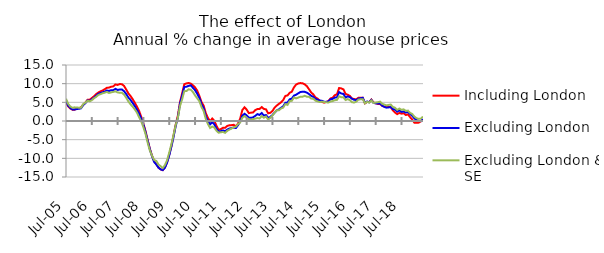
| Category | Including London | Excluding London | Excluding London & SE |
|---|---|---|---|
| 2005-07-01 | 4.985 | 5.285 | 5.958 |
| 2005-08-01 | 3.942 | 4.148 | 4.612 |
| 2005-09-01 | 3.341 | 3.501 | 3.879 |
| 2005-10-01 | 3.024 | 3.094 | 3.539 |
| 2005-11-01 | 3.025 | 3.077 | 3.658 |
| 2005-12-01 | 3.322 | 3.21 | 3.603 |
| 2006-01-01 | 3.425 | 3.273 | 3.573 |
| 2006-02-01 | 3.671 | 3.415 | 3.543 |
| 2006-03-01 | 4.341 | 4.268 | 4.537 |
| 2006-04-01 | 4.935 | 4.761 | 4.907 |
| 2006-05-01 | 5.674 | 5.506 | 5.421 |
| 2006-06-01 | 5.696 | 5.38 | 5.292 |
| 2006-07-01 | 6.145 | 5.816 | 5.555 |
| 2006-08-01 | 6.611 | 6.227 | 6.099 |
| 2006-09-01 | 7.182 | 6.748 | 6.46 |
| 2006-10-01 | 7.614 | 7.259 | 6.976 |
| 2006-11-01 | 7.936 | 7.496 | 7.178 |
| 2006-12-01 | 8.161 | 7.69 | 7.429 |
| 2007-01-01 | 8.511 | 7.868 | 7.579 |
| 2007-02-01 | 8.903 | 8.173 | 7.775 |
| 2007-03-01 | 8.951 | 8.042 | 7.493 |
| 2007-04-01 | 9.183 | 8.253 | 7.683 |
| 2007-05-01 | 9.276 | 8.26 | 7.795 |
| 2007-06-01 | 9.793 | 8.619 | 7.94 |
| 2007-07-01 | 9.657 | 8.303 | 7.666 |
| 2007-08-01 | 9.904 | 8.435 | 7.557 |
| 2007-09-01 | 9.848 | 8.43 | 7.59 |
| 2007-10-01 | 9.4 | 7.992 | 7.065 |
| 2007-11-01 | 8.429 | 7.205 | 6.216 |
| 2007-12-01 | 7.399 | 6.295 | 5.257 |
| 2008-01-01 | 6.692 | 5.641 | 4.468 |
| 2008-02-01 | 5.846 | 4.829 | 3.835 |
| 2008-03-01 | 4.892 | 3.992 | 3.095 |
| 2008-04-01 | 3.832 | 3.006 | 2.25 |
| 2008-05-01 | 2.671 | 1.945 | 1 |
| 2008-06-01 | 1.093 | 0.56 | -0.149 |
| 2008-07-01 | -0.669 | -0.999 | -1.68 |
| 2008-08-01 | -2.797 | -3.023 | -3.517 |
| 2008-09-01 | -5.166 | -5.325 | -5.862 |
| 2008-10-01 | -7.43 | -7.61 | -7.915 |
| 2008-11-01 | -9.307 | -9.425 | -9.312 |
| 2008-12-01 | -10.774 | -10.987 | -10.43 |
| 2009-01-01 | -11.579 | -11.649 | -10.704 |
| 2009-02-01 | -12.48 | -12.489 | -11.651 |
| 2009-03-01 | -12.965 | -12.948 | -12.105 |
| 2009-04-01 | -13.168 | -13.142 | -12.6 |
| 2009-05-01 | -12.416 | -12.532 | -11.801 |
| 2009-06-01 | -11.052 | -11.15 | -10.53 |
| 2009-07-01 | -9.03 | -9.21 | -8.474 |
| 2009-08-01 | -6.728 | -6.864 | -6.24 |
| 2009-09-01 | -3.894 | -4.294 | -3.737 |
| 2009-10-01 | -0.973 | -1.356 | -1.099 |
| 2009-11-01 | 1.393 | 0.824 | 0.793 |
| 2009-12-01 | 5.017 | 4.628 | 4.013 |
| 2010-01-01 | 7.384 | 6.795 | 5.826 |
| 2010-02-01 | 9.855 | 9.102 | 7.992 |
| 2010-03-01 | 10.07 | 9.191 | 8.012 |
| 2010-04-01 | 10.175 | 9.397 | 8.489 |
| 2010-05-01 | 10.021 | 9.556 | 8.394 |
| 2010-06-01 | 9.57 | 8.896 | 7.769 |
| 2010-07-01 | 9.01 | 8.261 | 6.872 |
| 2010-08-01 | 8.161 | 7.3 | 6.091 |
| 2010-09-01 | 6.737 | 6.228 | 5.324 |
| 2010-10-01 | 5.097 | 4.504 | 3.767 |
| 2010-11-01 | 4.119 | 3.44 | 2.672 |
| 2010-12-01 | 2.107 | 1.205 | 0.55 |
| 2011-01-01 | 0.832 | -0.007 | -0.817 |
| 2011-02-01 | -0.064 | -0.916 | -1.859 |
| 2011-03-01 | 0.664 | -0.28 | -1.49 |
| 2011-04-01 | 0.04 | -0.934 | -1.774 |
| 2011-05-01 | -1.33 | -2.127 | -2.627 |
| 2011-06-01 | -2.373 | -2.831 | -3.144 |
| 2011-07-01 | -2.175 | -2.71 | -3.01 |
| 2011-08-01 | -1.82 | -2.516 | -2.938 |
| 2011-09-01 | -1.818 | -2.744 | -3.18 |
| 2011-10-01 | -1.307 | -2.289 | -2.634 |
| 2011-11-01 | -1.143 | -2.026 | -2.293 |
| 2011-12-01 | -1.106 | -1.913 | -2.005 |
| 2012-01-01 | -1.024 | -1.746 | -1.671 |
| 2012-02-01 | -1.426 | -1.884 | -1.522 |
| 2012-03-01 | -0.681 | -1.106 | -0.818 |
| 2012-04-01 | 0.648 | -0.153 | -0.4 |
| 2012-05-01 | 2.927 | 1.429 | 0.849 |
| 2012-06-01 | 3.668 | 1.93 | 1.317 |
| 2012-07-01 | 3.062 | 1.519 | 0.896 |
| 2012-08-01 | 2.114 | 0.898 | 0.451 |
| 2012-09-01 | 2.228 | 0.844 | 0.317 |
| 2012-10-01 | 2.288 | 0.995 | 0.512 |
| 2012-11-01 | 2.919 | 1.375 | 0.638 |
| 2012-12-01 | 3.206 | 1.844 | 0.799 |
| 2013-01-01 | 3.214 | 1.629 | 0.672 |
| 2013-02-01 | 3.732 | 2.132 | 1.317 |
| 2013-03-01 | 3.237 | 1.465 | 0.874 |
| 2013-04-01 | 3.126 | 1.601 | 1.197 |
| 2013-05-01 | 2.056 | 0.826 | 0.387 |
| 2013-06-01 | 2.192 | 1.082 | 0.837 |
| 2013-07-01 | 2.68 | 1.598 | 1.466 |
| 2013-08-01 | 3.576 | 2.238 | 2.209 |
| 2013-09-01 | 4.132 | 2.856 | 2.896 |
| 2013-10-01 | 4.582 | 3.11 | 2.859 |
| 2013-11-01 | 4.995 | 3.562 | 3.359 |
| 2013-12-01 | 5.615 | 3.935 | 3.597 |
| 2014-01-01 | 6.711 | 4.89 | 4.53 |
| 2014-02-01 | 6.851 | 4.941 | 4.299 |
| 2014-03-01 | 7.542 | 5.812 | 5.315 |
| 2014-04-01 | 7.849 | 5.997 | 5.41 |
| 2014-05-01 | 9.019 | 6.795 | 6.287 |
| 2014-06-01 | 9.76 | 7.049 | 6.056 |
| 2014-07-01 | 10.057 | 7.413 | 6.278 |
| 2014-08-01 | 10.16 | 7.769 | 6.496 |
| 2014-09-01 | 10.09 | 7.834 | 6.504 |
| 2014-10-01 | 9.812 | 7.805 | 6.748 |
| 2014-11-01 | 9.335 | 7.601 | 6.516 |
| 2014-12-01 | 8.503 | 7.208 | 6.49 |
| 2015-01-01 | 7.651 | 6.75 | 6 |
| 2015-02-01 | 7.124 | 6.448 | 5.968 |
| 2015-03-01 | 6.321 | 5.929 | 5.435 |
| 2015-04-01 | 5.99 | 5.687 | 5.261 |
| 2015-05-01 | 5.409 | 5.478 | 5.063 |
| 2015-06-01 | 5.131 | 5.413 | 5.195 |
| 2015-07-01 | 4.913 | 5.172 | 5.091 |
| 2015-08-01 | 5.133 | 5.094 | 5.012 |
| 2015-09-01 | 5.322 | 5.273 | 4.949 |
| 2015-10-01 | 6.036 | 5.817 | 5.224 |
| 2015-11-01 | 6.255 | 5.933 | 5.346 |
| 2015-12-01 | 6.922 | 6.268 | 5.57 |
| 2016-01-01 | 7.158 | 6.346 | 5.646 |
| 2016-02-01 | 8.835 | 7.743 | 6.625 |
| 2016-03-01 | 8.737 | 7.362 | 6.354 |
| 2016-04-01 | 8.47 | 7.276 | 6.353 |
| 2016-05-01 | 7.262 | 6.277 | 5.616 |
| 2016-06-01 | 7.03 | 6.586 | 5.858 |
| 2016-07-01 | 6.71 | 6.388 | 5.574 |
| 2016-08-01 | 6.003 | 5.961 | 5.031 |
| 2016-09-01 | 5.878 | 5.678 | 4.945 |
| 2016-10-01 | 5.799 | 5.619 | 5.192 |
| 2016-11-01 | 6.242 | 5.99 | 5.735 |
| 2016-12-01 | 6.219 | 6.098 | 5.821 |
| 2017-01-01 | 6.22 | 6.214 | 5.843 |
| 2017-02-01 | 4.728 | 4.847 | 4.72 |
| 2017-03-01 | 5.107 | 5.232 | 5.154 |
| 2017-04-01 | 5.071 | 5.011 | 4.911 |
| 2017-05-01 | 5.741 | 5.651 | 5.507 |
| 2017-06-01 | 4.958 | 4.829 | 4.841 |
| 2017-07-01 | 4.734 | 4.732 | 4.939 |
| 2017-08-01 | 4.574 | 4.699 | 5.042 |
| 2017-09-01 | 4.575 | 4.693 | 5.183 |
| 2017-10-01 | 4.079 | 4.099 | 4.607 |
| 2017-11-01 | 3.857 | 3.793 | 4.409 |
| 2017-12-01 | 3.787 | 3.573 | 4.184 |
| 2018-01-01 | 3.818 | 3.643 | 4.313 |
| 2018-02-01 | 3.685 | 3.732 | 4.4 |
| 2018-03-01 | 2.846 | 3.189 | 3.763 |
| 2018-04-01 | 2.257 | 3.063 | 3.554 |
| 2018-05-01 | 1.842 | 2.511 | 2.97 |
| 2018-06-01 | 2.172 | 2.846 | 3.33 |
| 2018-07-01 | 1.971 | 2.441 | 2.997 |
| 2018-08-01 | 2.077 | 2.548 | 3.112 |
| 2018-09-01 | 1.602 | 2.26 | 2.711 |
| 2018-10-01 | 1.781 | 2.418 | 2.785 |
| 2018-11-01 | 1.028 | 1.89 | 2.18 |
| 2018-12-01 | 0.371 | 1.398 | 1.865 |
| 2019-01-01 | -0.457 | 0.689 | 1.165 |
| 2019-02-01 | -0.482 | 0.257 | 0.755 |
| 2019-03-01 | -0.436 | 0.032 | 0.567 |
| 2019-04-01 | -0.076 | -0.033 | 0.637 |
| 2019-05-01 | 0.329 | 0.453 | 1.155 |